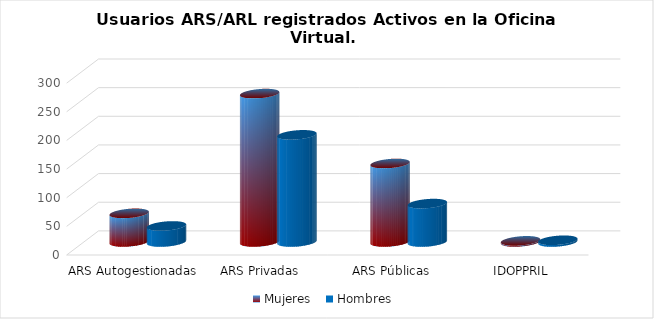
| Category | Mujeres | Hombres |
|---|---|---|
| ARS Autogestionadas | 50 | 28 |
| ARS Privadas | 259 | 187 |
| ARS Públicas | 137 | 67 |
| IDOPPRIL | 2 | 3 |